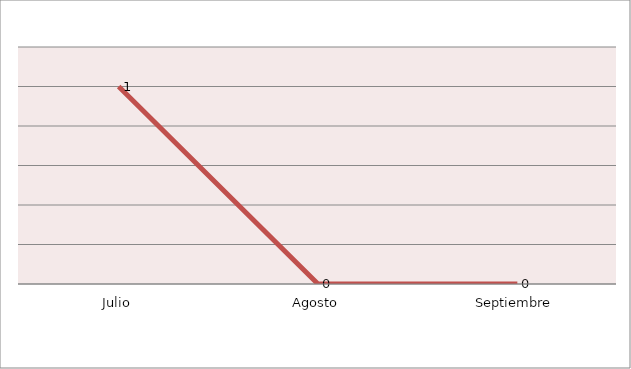
| Category | Series 0 |
|---|---|
| Julio | 1 |
| Agosto | 0 |
| Septiembre | 0 |